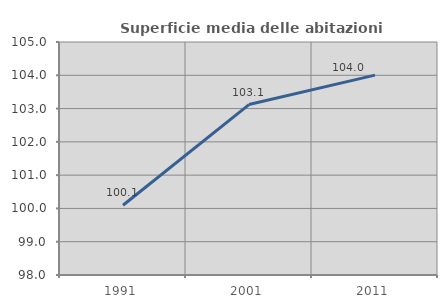
| Category | Superficie media delle abitazioni occupate |
|---|---|
| 1991.0 | 100.095 |
| 2001.0 | 103.121 |
| 2011.0 | 104.004 |